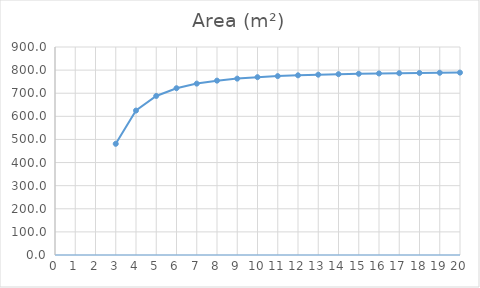
| Category | Area (m²) |
|---|---|
| 3.0 | 481.125 |
| 4.0 | 625 |
| 5.0 | 688.191 |
| 6.0 | 721.688 |
| 7.0 | 741.615 |
| 8.0 | 754.442 |
| 9.0 | 763.188 |
| 10.0 | 769.421 |
| 11.0 | 774.02 |
| 12.0 | 777.511 |
| 13.0 | 780.223 |
| 14.0 | 782.373 |
| 15.0 | 784.105 |
| 16.0 | 785.522 |
| 17.0 | 786.695 |
| 18.0 | 787.678 |
| 19.0 | 788.509 |
| 20.0 | 789.219 |